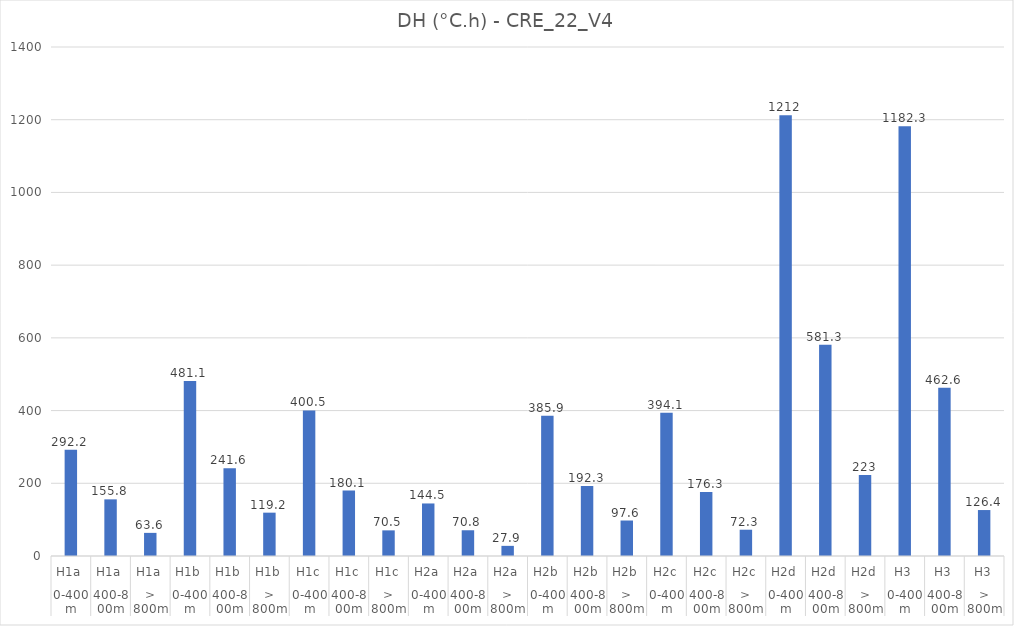
| Category | Degrés-heures d'inconfort DH (°C,h) |
|---|---|
| 0 | 292.2 |
| 1 | 155.8 |
| 2 | 63.6 |
| 3 | 481.1 |
| 4 | 241.6 |
| 5 | 119.2 |
| 6 | 400.5 |
| 7 | 180.1 |
| 8 | 70.5 |
| 9 | 144.5 |
| 10 | 70.8 |
| 11 | 27.9 |
| 12 | 385.9 |
| 13 | 192.3 |
| 14 | 97.6 |
| 15 | 394.1 |
| 16 | 176.3 |
| 17 | 72.3 |
| 18 | 1212 |
| 19 | 581.3 |
| 20 | 223 |
| 21 | 1182.3 |
| 22 | 462.6 |
| 23 | 126.4 |